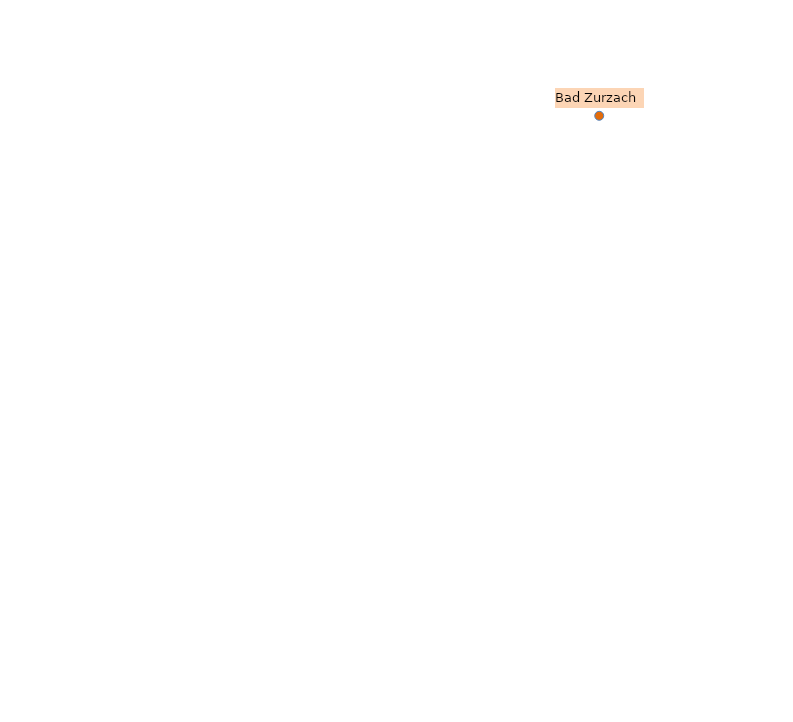
| Category | Bad Zurzach |
|---|---|
| 12.142544275380395 | 13.841 |